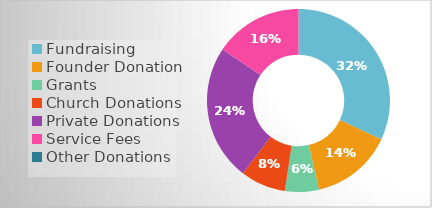
| Category | Series 0 |
|---|---|
| Fundraising | 0.32 |
| Founder Donation | 0.144 |
| Grants | 0.06 |
| Church Donations | 0.08 |
| Private Donations | 0.24 |
| Service Fees | 0.156 |
| Other Donations | 0 |